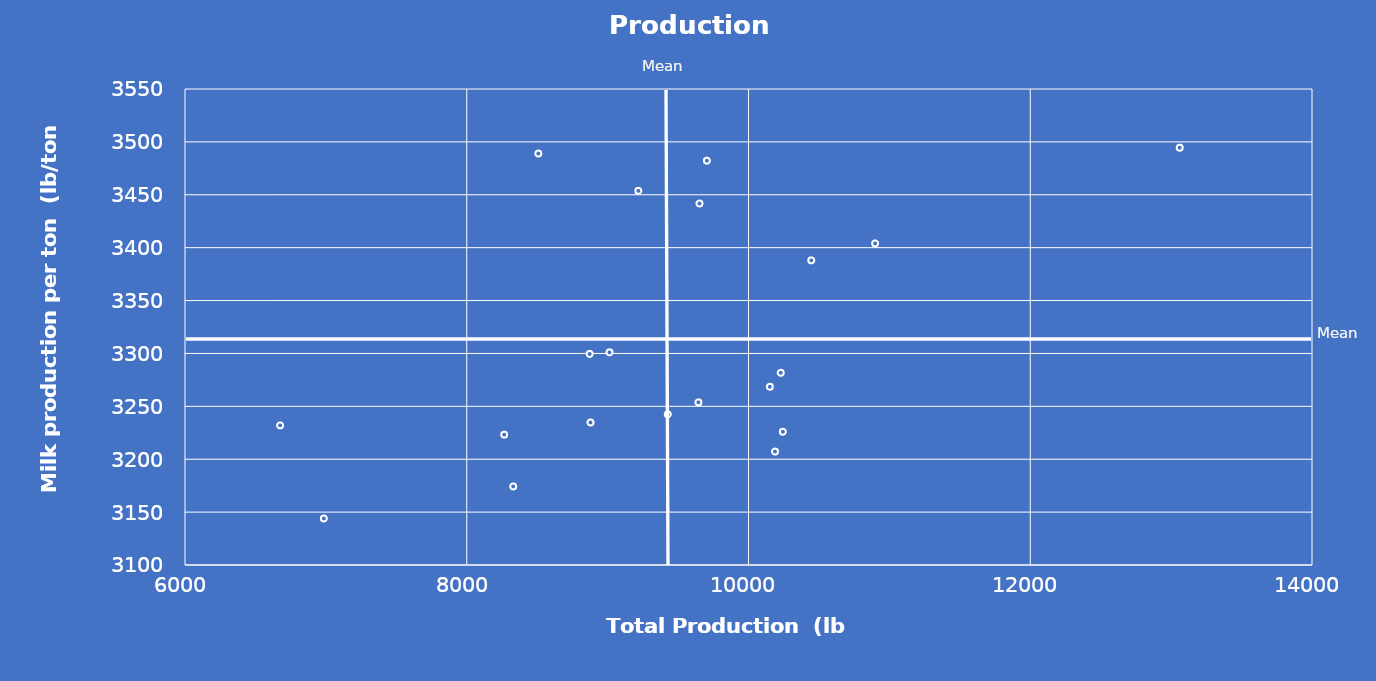
| Category | Series 0 |
|---|---|
| 10899.154847297 | 3404 |
| 10228.570300978 | 3281.75 |
| 8872.302643142 | 3299.5 |
| 9644.278590388 | 3253.75 |
| 10243.852587358 | 3226 |
| 8507.866602683 | 3489 |
| 6985.729932177 | 3144 |
| 6675.063149129 | 3232 |
| 10188.055174885 | 3207.25 |
| 8329.546455692 | 3174.25 |
| 9426.86045782 | 3242.5 |
| 13060.934951174 | 3494.5 |
| 9218.011507239 | 3453.75 |
| 9704.694797988 | 3482.25 |
| 9013.489085496 | 3301 |
| 9651.748210202 | 3441.75 |
| 8878.265487491 | 3234.75 |
| 10151.391159723 | 3268.5 |
| 10445.753989197 | 3388 |
| 8265.400138652 | 3223.25 |